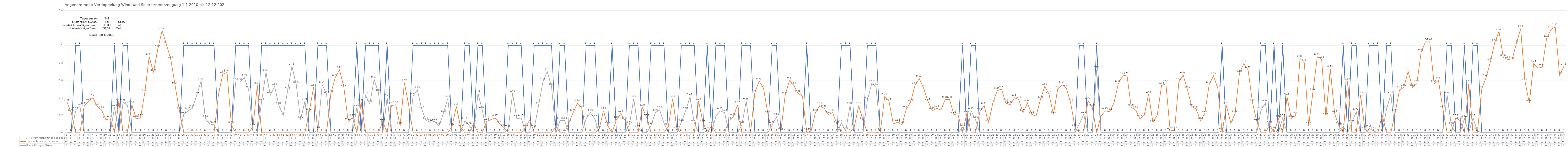
| Category | 1 = Strom reicht für den Tag aus | Zusätzlich benötigter Strom | Überschüssiger Strom |
|---|---|---|---|
| 0 | 0 | 0.35 | 0 |
| 1 | 0 | 0.23 | 0 |
| 2 | 1 | 0 | 0.25 |
| 3 | 1 | 0 | 0.3 |
| 4 | 0 | 0.31 | 0 |
| 5 | 0 | 0.36 | 0 |
| 6 | 0 | 0.4 | 0 |
| 7 | 0 | 0.3 | 0 |
| 8 | 0 | 0.26 | 0 |
| 9 | 0 | 0.15 | 0 |
| 10 | 0 | 0.16 | 0 |
| 11 | 1 | 0 | 0.29 |
| 12 | 0 | 0.36 | 0 |
| 13 | 1 | 0 | 0.35 |
| 14 | 1 | 0 | 0.31 |
| 15 | 0 | 0.32 | 0 |
| 16 | 0 | 0.16 | 0 |
| 17 | 0 | 0.17 | 0 |
| 18 | 0 | 0.46 | 0 |
| 19 | 0 | 0.87 | 0 |
| 20 | 0 | 0.69 | 0 |
| 21 | 0 | 0.96 | 0 |
| 22 | 0 | 1.17 | 0 |
| 23 | 0 | 1.01 | 0 |
| 24 | 0 | 0.84 | 0 |
| 25 | 0 | 0.54 | 0 |
| 26 | 0 | 0.25 | 0 |
| 27 | 1 | 0 | 0.21 |
| 28 | 1 | 0 | 0.25 |
| 29 | 1 | 0 | 0.28 |
| 30 | 1 | 0 | 0.43 |
| 31 | 1 | 0 | 0.59 |
| 32 | 1 | 0 | 0.16 |
| 33 | 1 | 0 | 0.1 |
| 34 | 1 | 0 | 0.09 |
| 35 | 0 | 0.43 | 0 |
| 36 | 0 | 0.67 | 0 |
| 37 | 0 | 0.69 | 0 |
| 38 | 0 | 0.09 | 0 |
| 39 | 1 | 0 | 0.58 |
| 40 | 1 | 0 | 0.58 |
| 41 | 1 | 0 | 0.63 |
| 42 | 1 | 0 | 0.49 |
| 43 | 0 | 0.07 | 0 |
| 44 | 0 | 0.54 | 0 |
| 45 | 1 | 0 | 0.36 |
| 46 | 1 | 0 | 0.69 |
| 47 | 1 | 0 | 0.43 |
| 48 | 1 | 0 | 0.53 |
| 49 | 1 | 0 | 0.31 |
| 50 | 1 | 0 | 0.2 |
| 51 | 1 | 0 | 0.48 |
| 52 | 1 | 0 | 0.76 |
| 53 | 1 | 0 | 0.55 |
| 54 | 1 | 0 | 0.15 |
| 55 | 1 | 0 | 0.36 |
| 56 | 0 | 0.24 | 0 |
| 57 | 0 | 0.52 | 0 |
| 58 | 1 | 0 | 0.03 |
| 59 | 1 | 0 | 0.55 |
| 60 | 1 | 0 | 0.44 |
| 61 | 0 | 0.45 | 0 |
| 62 | 0 | 0.63 | 0 |
| 63 | 0 | 0.72 | 0 |
| 64 | 0 | 0.52 | 0 |
| 65 | 0 | 0.13 | 0 |
| 66 | 0 | 0.17 | 0 |
| 67 | 1 | 0 | 0.29 |
| 68 | 0 | 0.35 | 0 |
| 69 | 1 | 0 | 0.43 |
| 70 | 1 | 0 | 0.33 |
| 71 | 1 | 0 | 0.61 |
| 72 | 1 | 0 | 0.46 |
| 73 | 0 | 0.13 | 0 |
| 74 | 1 | 0 | 0.4 |
| 75 | 0 | 0.31 | 0 |
| 76 | 0 | 0.32 | 0 |
| 77 | 0 | 0.08 | 0 |
| 78 | 0 | 0.57 | 0 |
| 79 | 0 | 0.31 | 0 |
| 80 | 1 | 0 | 0.42 |
| 81 | 1 | 0 | 0.49 |
| 82 | 1 | 0 | 0.27 |
| 83 | 1 | 0 | 0.14 |
| 84 | 1 | 0 | 0.12 |
| 85 | 1 | 0 | 0.13 |
| 86 | 1 | 0 | 0.08 |
| 87 | 1 | 0 | 0.22 |
| 88 | 1 | 0 | 0.39 |
| 89 | 0 | 0.07 | 0 |
| 90 | 0 | 0.3 | 0 |
| 91 | 0 | 0.06 | 0 |
| 92 | 1 | 0 | 0.14 |
| 93 | 1 | 0 | 0.08 |
| 94 | 0 | 0.11 | 0 |
| 95 | 1 | 0 | 0.45 |
| 96 | 1 | 0 | 0.26 |
| 97 | 0 | 0.13 | 0 |
| 98 | 0 | 0.15 | 0 |
| 99 | 0 | 0.17 | 0 |
| 100 | 0 | 0.1 | 0 |
| 101 | 0 | 0.06 | 0 |
| 102 | 1 | 0 | 0.05 |
| 103 | 1 | 0 | 0.45 |
| 104 | 1 | 0 | 0.16 |
| 105 | 1 | 0 | 0.17 |
| 106 | 0 | 0.06 | 0 |
| 107 | 0 | 0.15 | 0 |
| 108 | 1 | 0 | 0.05 |
| 109 | 1 | 0 | 0.31 |
| 110 | 1 | 0 | 0.58 |
| 111 | 1 | 0 | 0.7 |
| 112 | 1 | 0 | 0.53 |
| 113 | 0 | 0.07 | 0 |
| 114 | 1 | 0 | 0.14 |
| 115 | 1 | 0 | 0.14 |
| 116 | 0 | 0.11 | 0 |
| 117 | 0 | 0.23 | 0 |
| 118 | 0 | 0.34 | 0 |
| 119 | 0 | 0.28 | 0 |
| 120 | 1 | 0 | 0.16 |
| 121 | 1 | 0 | 0.23 |
| 122 | 1 | 0 | 0.16 |
| 123 | 0 | 0.04 | 0 |
| 124 | 0 | 0.25 | 0 |
| 125 | 0 | 0.08 | 0 |
| 126 | 1 | 0 | 0 |
| 127 | 0 | 0.15 | 0 |
| 128 | 0 | 0.22 | 0 |
| 129 | 0 | 0.14 | 0 |
| 130 | 1 | 0 | 0.09 |
| 131 | 1 | 0 | 0.39 |
| 132 | 1 | 0 | 0.05 |
| 133 | 0 | 0.29 | 0 |
| 134 | 0 | 0.17 | 0 |
| 135 | 1 | 0 | 0.08 |
| 136 | 1 | 0 | 0.23 |
| 137 | 1 | 0 | 0.26 |
| 138 | 1 | 0 | 0.11 |
| 139 | 0 | 0.07 | 0 |
| 140 | 0 | 0.39 | 0 |
| 141 | 0 | 0.04 | 0 |
| 142 | 1 | 0 | 0.12 |
| 143 | 1 | 0 | 0.25 |
| 144 | 1 | 0 | 0.41 |
| 145 | 1 | 0 | 0.11 |
| 146 | 0 | 0.36 | 0 |
| 147 | 0 | 0.12 | 0 |
| 148 | 1 | 0 | 0.02 |
| 149 | 0 | 0.08 | 0 |
| 150 | 1 | 0 | 0.19 |
| 151 | 1 | 0 | 0.25 |
| 152 | 1 | 0 | 0.23 |
| 153 | 0 | 0.14 | 0 |
| 154 | 0 | 0.18 | 0 |
| 155 | 0 | 0.32 | 0 |
| 156 | 1 | 0 | 0.09 |
| 157 | 1 | 0 | 0.36 |
| 158 | 1 | 0 | 0 |
| 159 | 0 | 0.46 | 0 |
| 160 | 0 | 0.59 | 0 |
| 161 | 0 | 0.51 | 0 |
| 162 | 0 | 0.22 | 0 |
| 163 | 1 | 0 | 0.09 |
| 164 | 1 | 0 | 0.18 |
| 165 | 0 | 0.01 | 0 |
| 166 | 0 | 0.43 | 0 |
| 167 | 0 | 0.6 | 0 |
| 168 | 0 | 0.54 | 0 |
| 169 | 0 | 0.45 | 0 |
| 170 | 0 | 0.42 | 0 |
| 171 | 1 | 0 | 0.01 |
| 172 | 0 | 0.02 | 0 |
| 173 | 0 | 0.23 | 0 |
| 174 | 0 | 0.31 | 0 |
| 175 | 0 | 0.28 | 0 |
| 176 | 0 | 0.21 | 0 |
| 177 | 0 | 0.23 | 0 |
| 178 | 0 | 0.09 | 0 |
| 179 | 1 | 0 | 0.11 |
| 180 | 1 | 0 | 0.02 |
| 181 | 1 | 0 | 0.31 |
| 182 | 0 | 0.07 | 0 |
| 183 | 0 | 0.31 | 0 |
| 184 | 0 | 0.14 | 0 |
| 185 | 1 | 0 | 0.37 |
| 186 | 1 | 0 | 0.56 |
| 187 | 1 | 0 | 0.53 |
| 188 | 0 | 0.01 | 0 |
| 189 | 0 | 0.41 | 0 |
| 190 | 0 | 0.36 | 0 |
| 191 | 0 | 0.1 | 0 |
| 192 | 0 | 0.12 | 0 |
| 193 | 0 | 0.09 | 0 |
| 194 | 0 | 0.27 | 0 |
| 195 | 0 | 0.35 | 0 |
| 196 | 0 | 0.54 | 0 |
| 197 | 0 | 0.62 | 0 |
| 198 | 0 | 0.51 | 0 |
| 199 | 0 | 0.36 | 0 |
| 200 | 0 | 0.25 | 0 |
| 201 | 0 | 0.28 | 0 |
| 202 | 0 | 0.26 | 0 |
| 203 | 0 | 0.38 | 0 |
| 204 | 0 | 0.38 | 0 |
| 205 | 0 | 0.21 | 0 |
| 206 | 0 | 0.2 | 0 |
| 207 | 1 | 0 | 0.06 |
| 208 | 0 | 0.22 | 0 |
| 209 | 1 | 0 | 0.25 |
| 210 | 1 | 0 | 0.15 |
| 211 | 0 | 0.24 | 0 |
| 212 | 0 | 0.31 | 0 |
| 213 | 0 | 0.11 | 0 |
| 214 | 0 | 0.34 | 0 |
| 215 | 0 | 0.48 | 0 |
| 216 | 0 | 0.5 | 0 |
| 217 | 0 | 0.34 | 0 |
| 218 | 0 | 0.32 | 0 |
| 219 | 0 | 0.4 | 0 |
| 220 | 0 | 0.38 | 0 |
| 221 | 0 | 0.23 | 0 |
| 222 | 0 | 0.34 | 0 |
| 223 | 0 | 0.21 | 0 |
| 224 | 0 | 0.19 | 0 |
| 225 | 0 | 0.38 | 0 |
| 226 | 0 | 0.53 | 0 |
| 227 | 0 | 0.44 | 0 |
| 228 | 0 | 0.21 | 0 |
| 229 | 0 | 0.5 | 0 |
| 230 | 0 | 0.55 | 0 |
| 231 | 0 | 0.51 | 0 |
| 232 | 0 | 0.34 | 0 |
| 233 | 0 | 0.06 | 0 |
| 234 | 1 | 0 | 0.1 |
| 235 | 1 | 0 | 0.21 |
| 236 | 0 | 0.37 | 0 |
| 237 | 0 | 0.29 | 0 |
| 238 | 1 | 0 | 0.72 |
| 239 | 0 | 0.19 | 0 |
| 240 | 0 | 0.25 | 0 |
| 241 | 0 | 0.24 | 0 |
| 242 | 0 | 0.34 | 0 |
| 243 | 0 | 0.56 | 0 |
| 244 | 0 | 0.65 | 0 |
| 245 | 0 | 0.66 | 0 |
| 246 | 0 | 0.29 | 0 |
| 247 | 0 | 0.26 | 0 |
| 248 | 0 | 0.16 | 0 |
| 249 | 0 | 0.2 | 0 |
| 250 | 0 | 0.44 | 0 |
| 251 | 0 | 0.12 | 0 |
| 252 | 0 | 0.2 | 0 |
| 253 | 0 | 0.54 | 0 |
| 254 | 0 | 0.56 | 0 |
| 255 | 0 | 0.02 | 0 |
| 256 | 0 | 0.03 | 0 |
| 257 | 0 | 0.58 | 0 |
| 258 | 0 | 0.66 | 0 |
| 259 | 0 | 0.49 | 0 |
| 260 | 0 | 0.3 | 0 |
| 261 | 0 | 0.27 | 0 |
| 262 | 0 | 0.14 | 0 |
| 263 | 0 | 0.22 | 0 |
| 264 | 0 | 0.55 | 0 |
| 265 | 0 | 0.65 | 0 |
| 266 | 0 | 0.51 | 0 |
| 267 | 1 | 0 | 0.02 |
| 268 | 0 | 0.31 | 0 |
| 269 | 0 | 0.11 | 0 |
| 270 | 0 | 0.22 | 0 |
| 271 | 0 | 0.68 | 0 |
| 272 | 0 | 0.79 | 0 |
| 273 | 0 | 0.72 | 0 |
| 274 | 0 | 0.35 | 0 |
| 275 | 0 | 0.13 | 0 |
| 276 | 1 | 0 | 0.26 |
| 277 | 1 | 0 | 0.34 |
| 278 | 0 | 0.09 | 0 |
| 279 | 1 | 0 | 0.03 |
| 280 | 0 | 0.16 | 0 |
| 281 | 1 | 0 | 0.17 |
| 282 | 0 | 0.41 | 0 |
| 283 | 0 | 0.16 | 0 |
| 284 | 0 | 0.2 | 0 |
| 285 | 0 | 0.85 | 0 |
| 286 | 0 | 0.8 | 0 |
| 287 | 0 | 0.08 | 0 |
| 288 | 0 | 0.47 | 0 |
| 289 | 0 | 0.87 | 0 |
| 290 | 0 | 0.84 | 0 |
| 291 | 0 | 0.18 | 0 |
| 292 | 0 | 0.73 | 0 |
| 293 | 0 | 0.22 | 0 |
| 294 | 0 | 0.08 | 0 |
| 295 | 1 | 0 | 0.07 |
| 296 | 0 | 0.59 | 0 |
| 297 | 1 | 0 | 0.12 |
| 298 | 1 | 0 | 0.24 |
| 299 | 0 | 0.43 | 0 |
| 300 | 0 | 0.04 | 0 |
| 301 | 1 | 0 | 0.05 |
| 302 | 1 | 0 | 0.02 |
| 303 | 1 | 0 | 0 |
| 304 | 0 | 0.2 | 0 |
| 305 | 1 | 0 | 0.27 |
| 306 | 1 | 0 | 0.44 |
| 307 | 0 | 0.23 | 0 |
| 308 | 0 | 0.49 | 0 |
| 309 | 0 | 0.52 | 0 |
| 310 | 0 | 0.7 | 0 |
| 311 | 0 | 0.52 | 0 |
| 312 | 0 | 0.56 | 0 |
| 313 | 0 | 0.92 | 0 |
| 314 | 0 | 1.04 | 0 |
| 315 | 0 | 1.04 | 0 |
| 316 | 0 | 0.56 | 0 |
| 317 | 0 | 0.6 | 0 |
| 318 | 0 | 0.28 | 0 |
| 319 | 1 | 0 | 0.43 |
| 320 | 1 | 0 | 0.08 |
| 321 | 0 | 0.17 | 0 |
| 322 | 0 | 0.14 | 0 |
| 323 | 1 | 0 | 0.16 |
| 324 | 0 | 0.56 | 0 |
| 325 | 1 | 0 | 0.17 |
| 326 | 1 | 0 | 0.02 |
| 327 | 0 | 0.5 | 0 |
| 328 | 0 | 0.63 | 0 |
| 329 | 0 | 0.81 | 0 |
| 330 | 0 | 1.03 | 0 |
| 331 | 0 | 1.16 | 0 |
| 332 | 0 | 0.86 | 0 |
| 333 | 0 | 0.84 | 0 |
| 334 | 0 | 0.83 | 0 |
| 335 | 0 | 1.02 | 0 |
| 336 | 0 | 1.19 | 0 |
| 337 | 0 | 0.59 | 0 |
| 338 | 0 | 0.34 | 0 |
| 339 | 0 | 0.79 | 0 |
| 340 | 0 | 0.74 | 0 |
| 341 | 0 | 0.75 | 0 |
| 342 | 0 | 1.08 | 0 |
| 343 | 0 | 1.18 | 0 |
| 344 | 0 | 1.21 | 0 |
| 345 | 0 | 0.66 | 0 |
| 346 | 0 | 0.76 | 0 |